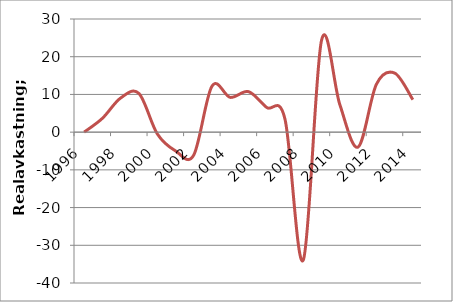
| Category | Reell |
|---|---|
| 1996.0 | 0 |
| 1997.0 | 3.664 |
| 1998.0 | 9.051 |
| 1999.0 | 10.255 |
| 2000.0 | -0.412 |
| 2001.0 | -4.955 |
| 2002.0 | -6.095 |
| 2003.0 | 12.191 |
| 2004.0 | 9.22 |
| 2005.0 | 10.741 |
| 2006.0 | 6.529 |
| 2007.0 | 3.413 |
| 2008.0 | -33.909 |
| 2009.0 | 24.362 |
| 2010.0 | 7.316 |
| 2011.0 | -3.956 |
| 2012.0 | 12.663 |
| 2013.0 | 15.669 |
| 2014.0 | 8.613 |